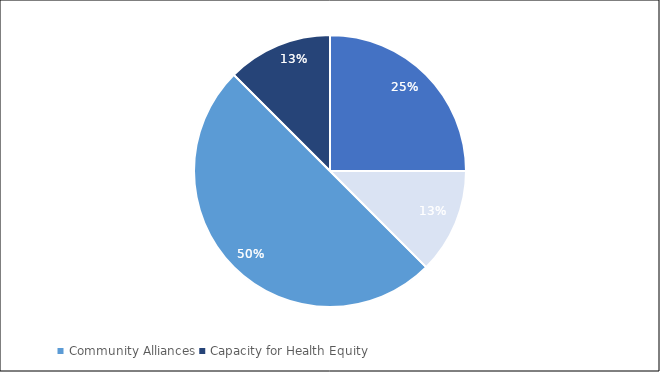
| Category | Series 0 | Series 1 |
|---|---|---|
| Resources | 2 |  |
| Data Access/Capacity | 1 |  |
| Community Alliances | 4 |  |
| Capacity for Health Equity | 1 |  |